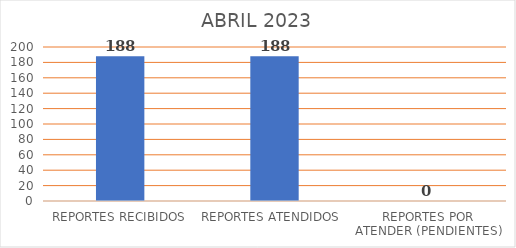
| Category | Series 0 |
|---|---|
| REPORTES RECIBIDOS | 188 |
| REPORTES ATENDIDOS  | 188 |
| REPORTES POR ATENDER (PENDIENTES) | 0 |